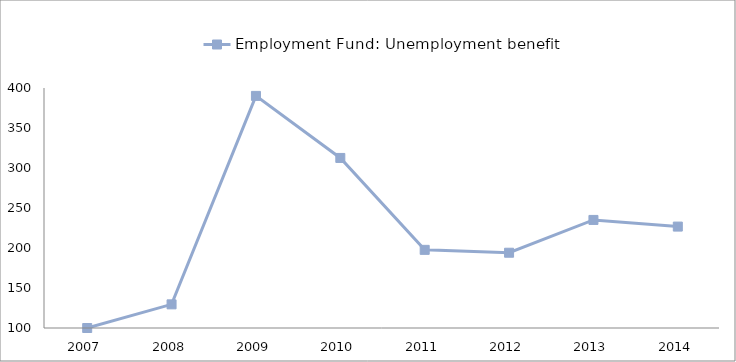
| Category | Employment Fund: Unemployment benefit | 0 |
|---|---|---|
| 2007.0 | 100 |  |
| 2008.0 | 129.558 |  |
| 2009.0 | 390.12 |  |
| 2010.0 | 312.575 |  |
| 2011.0 | 197.677 |  |
| 2012.0 | 194.095 |  |
| 2013.0 | 235.085 |  |
| 2014.0 | 226.769 |  |